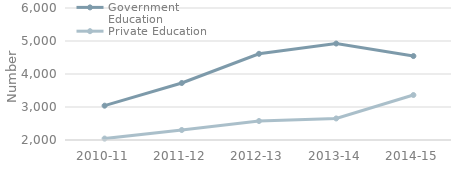
| Category | Government Education | Private Education |
|---|---|---|
| 2010-11 | 3040 | 2043 |
| 2011-12 | 3727 | 2303 |
| 2012-13 | 4612 | 2575 |
| 2013-14 | 4923 | 2653 |
| 2014-15 | 4544 | 3363 |